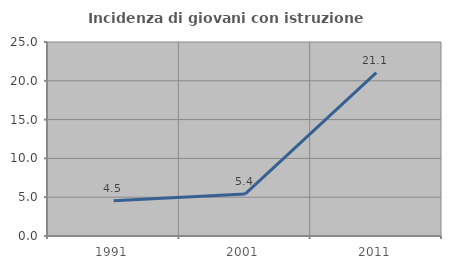
| Category | Incidenza di giovani con istruzione universitaria |
|---|---|
| 1991.0 | 4.545 |
| 2001.0 | 5.405 |
| 2011.0 | 21.053 |